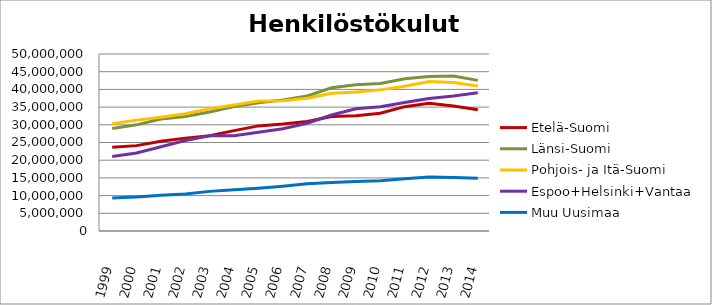
| Category | Etelä-Suomi | Länsi-Suomi | Pohjois- ja Itä-Suomi | Espoo+Helsinki+Vantaa | Muu Uusimaa |
|---|---|---|---|---|---|
| 1999.0 | 23642850.87 | 28940708.25 | 30306665.81 | 21035156.16 | 9308475.99 |
| 2000.0 | 24115985.59 | 29984783.07 | 31318456.92 | 22052128.16 | 9631449.8 |
| 2001.0 | 25357804.23 | 31655929.72 | 32139367.16 | 23806595.65 | 10120590.6 |
| 2002.0 | 26235974 | 32341518 | 33103619 | 25557916 | 10481611 |
| 2003.0 | 26888882 | 33627973 | 34505231 | 26877522 | 11194573 |
| 2004.0 | 28349246 | 35154582 | 35586050 | 26900261 | 11631967 |
| 2005.0 | 29691899 | 36203285 | 36714909 | 27893611 | 12100731 |
| 2006.0 | 30210030 | 36976963 | 36815588 | 28895209 | 12671815 |
| 2007.0 | 30947237 | 38125213 | 37524541 | 30449290 | 13328851 |
| 2008.0 | 32319963.21 | 40478495.9 | 38919422.01 | 32756481 | 13725223 |
| 2009.0 | 32533632.1 | 41333074.78 | 39278103.32 | 34548108.31 | 13967313.77 |
| 2010.0 | 33254966.95 | 41664219.18 | 39865282.44 | 35082426.97 | 14221862.99 |
| 2011.0 | 35125994.04 | 42988946.49 | 40878626.66 | 36322394.7 | 14746292.53 |
| 2012.0 | 36088358.21 | 43636639.7 | 42220450.03 | 37407066.14 | 15237916.96 |
| 2013.0 | 35285864.96 | 43751029.2 | 41938461.48 | 38152719.11 | 15094240 |
| 2014.0 | 34273752.96 | 42544604.26 | 40937956.53 | 39073999.96 | 14890950.46 |